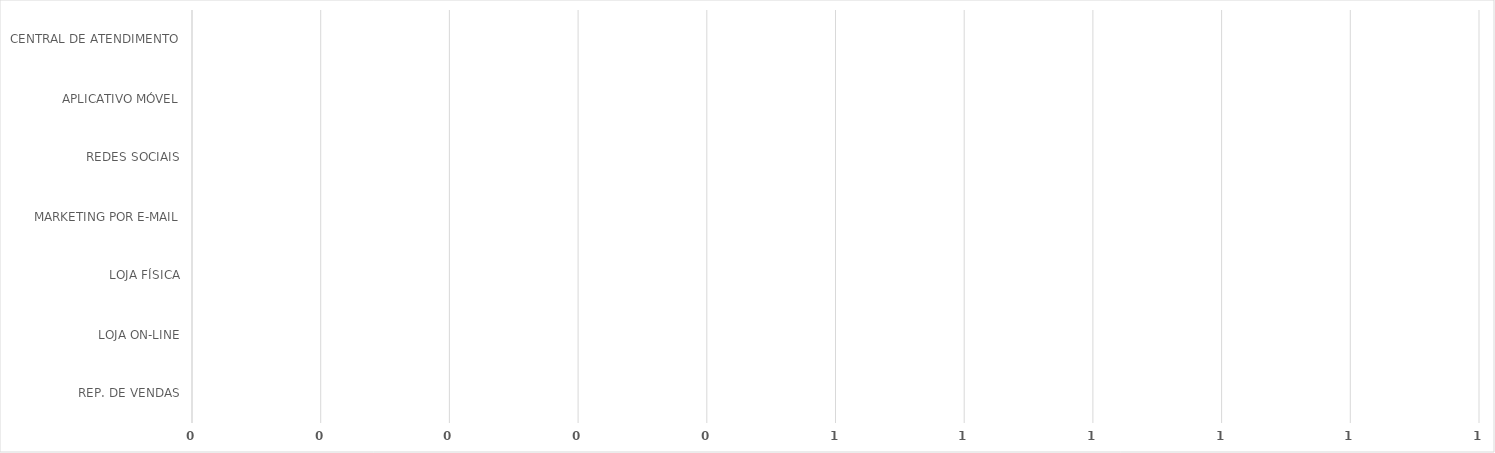
| Category | Series 0 |
|---|---|
| REP. DE VENDAS | 0 |
| LOJA ON-LINE | 0 |
| LOJA FÍSICA | 0 |
| MARKETING POR E-MAIL | 0 |
| REDES SOCIAIS | 0 |
| APLICATIVO MÓVEL | 0 |
| CENTRAL DE ATENDIMENTO | 0 |